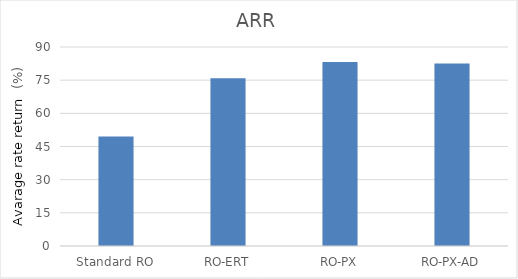
| Category | ARR |
|---|---|
| Standard RO | 49.489 |
| RO-ERT | 75.877 |
| RO-PX | 83.18 |
| RO-PX-AD | 82.565 |